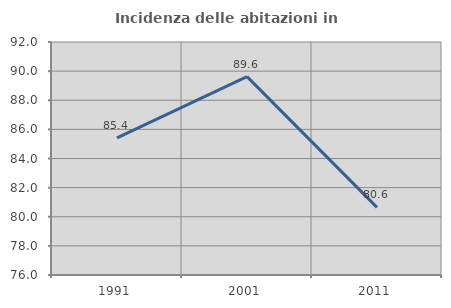
| Category | Incidenza delle abitazioni in proprietà  |
|---|---|
| 1991.0 | 85.417 |
| 2001.0 | 89.623 |
| 2011.0 | 80.645 |